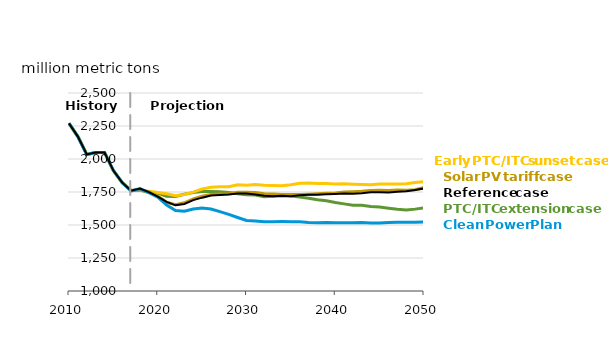
| Category | PTC/ITC Extension case | Early PTC/ITC Sunset case | Solar PV Tariff case  | Clean Power Plan | Reference case |
|---|---|---|---|---|---|
| 2010.0 | 2270.3 | 2270.3 | 2270.3 | 2270.3 | 2270.3 |
| 2011.0 | 2169.8 | 2169.8 | 2169.8 | 2169.8 | 2169.8 |
| 2012.0 | 2034.4 | 2034.4 | 2034.4 | 2034.4 | 2034.4 |
| 2013.0 | 2049.886 | 2049.886 | 2049.886 | 2049.886 | 2049.886 |
| 2014.0 | 2049.887 | 2049.887 | 2049.887 | 2049.887 | 2049.887 |
| 2015.0 | 1912.57 | 1912.57 | 1912.57 | 1912.57 | 1912.57 |
| 2016.0 | 1820.61 | 1820.61 | 1820.61 | 1820.61 | 1820.61 |
| 2017.0 | 1761.432 | 1761.077 | 1761.047 | 1757.267 | 1760.016 |
| 2018.0 | 1765.103 | 1765.104 | 1765.775 | 1775.496 | 1775.652 |
| 2019.0 | 1745.683 | 1756.125 | 1751.272 | 1745.23 | 1749.036 |
| 2020.0 | 1741.294 | 1746.135 | 1718.953 | 1710.825 | 1715.484 |
| 2021.0 | 1718.469 | 1736.078 | 1672.247 | 1650.325 | 1675.465 |
| 2022.0 | 1715.463 | 1721.386 | 1653.234 | 1609.94 | 1649.081 |
| 2023.0 | 1732.758 | 1731.649 | 1668.404 | 1604.75 | 1659.186 |
| 2024.0 | 1745.193 | 1748.708 | 1697.462 | 1621.298 | 1688.46 |
| 2025.0 | 1754.385 | 1772.581 | 1717.571 | 1629.322 | 1707.156 |
| 2026.0 | 1753.739 | 1785.993 | 1731.094 | 1620.737 | 1723.56 |
| 2027.0 | 1751.933 | 1790.687 | 1734.106 | 1601.2 | 1727.383 |
| 2028.0 | 1746.649 | 1790.321 | 1736.697 | 1579.982 | 1730.305 |
| 2029.0 | 1736.5 | 1805.429 | 1747.183 | 1557.037 | 1738.858 |
| 2030.0 | 1728.809 | 1801.901 | 1748.934 | 1534.353 | 1739.215 |
| 2031.0 | 1727.922 | 1806.407 | 1745.661 | 1530.034 | 1730.902 |
| 2032.0 | 1714.704 | 1800.609 | 1737.499 | 1525.234 | 1722.29 |
| 2033.0 | 1718.24 | 1799.039 | 1735.347 | 1525.26 | 1717.5 |
| 2034.0 | 1721.757 | 1797.703 | 1731.924 | 1525.993 | 1720.928 |
| 2035.0 | 1720.232 | 1805.601 | 1731.354 | 1525.432 | 1717.986 |
| 2036.0 | 1712.425 | 1816.024 | 1730.155 | 1523.933 | 1725.641 |
| 2037.0 | 1703.03 | 1817.429 | 1733.599 | 1519.026 | 1728.593 |
| 2038.0 | 1691.134 | 1813.969 | 1737.152 | 1517.444 | 1730.109 |
| 2039.0 | 1683.852 | 1813.703 | 1739.843 | 1519.017 | 1733.709 |
| 2040.0 | 1670.263 | 1810.086 | 1742.909 | 1516.489 | 1735.309 |
| 2041.0 | 1660.003 | 1813.013 | 1750.352 | 1516.856 | 1738.199 |
| 2042.0 | 1650.031 | 1809.628 | 1752.556 | 1516.522 | 1736.836 |
| 2043.0 | 1650.154 | 1807.554 | 1755.586 | 1518.749 | 1739.706 |
| 2044.0 | 1640.905 | 1805.631 | 1761.643 | 1514.9 | 1747.522 |
| 2045.0 | 1635.514 | 1811.289 | 1762.695 | 1515.194 | 1748.993 |
| 2046.0 | 1626.957 | 1811.068 | 1760.893 | 1518.238 | 1746.729 |
| 2047.0 | 1618.603 | 1810.403 | 1764.74 | 1520.929 | 1751.029 |
| 2048.0 | 1613.716 | 1813.137 | 1762.358 | 1519.903 | 1755.16 |
| 2049.0 | 1620.313 | 1822.409 | 1767.352 | 1520.925 | 1765.389 |
| 2050.0 | 1629.416 | 1828.029 | 1784.696 | 1522.101 | 1776.88 |